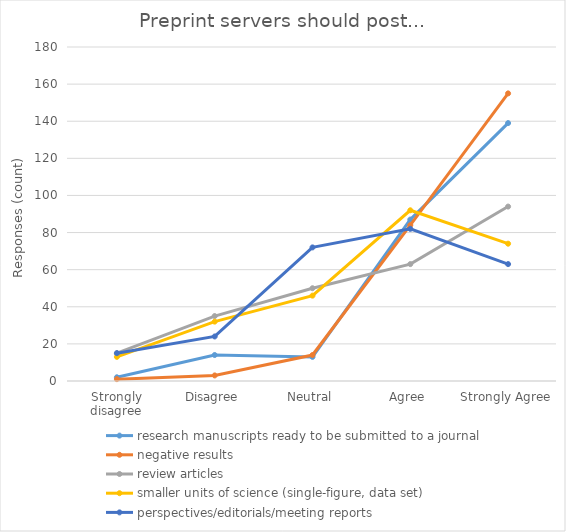
| Category | research manuscripts ready to be submitted to a journal | negative results | review articles | smaller units of science (single-figure, data set) | perspectives/editorials/meeting reports |
|---|---|---|---|---|---|
| Strongly disagree | 2 | 1 | 15 | 13 | 15 |
| Disagree | 14 | 3 | 35 | 32 | 24 |
| Neutral | 13 | 14 | 50 | 46 | 72 |
| Agree | 87 | 84 | 63 | 92 | 82 |
| Strongly Agree | 139 | 155 | 94 | 74 | 63 |